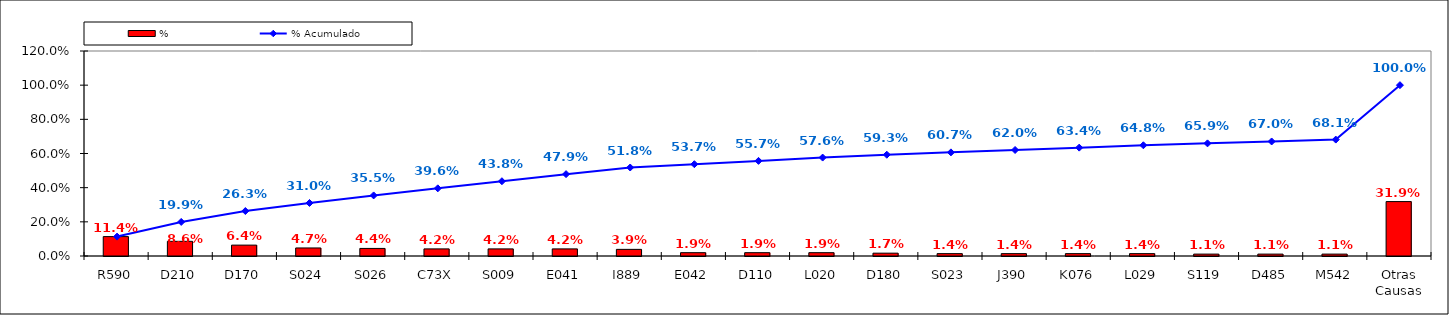
| Category | % |
|---|---|
| R590 | 0.114 |
| D210 | 0.086 |
| D170 | 0.064 |
| S024 | 0.047 |
| S026 | 0.044 |
| C73X | 0.042 |
| S009 | 0.042 |
| E041 | 0.042 |
| I889 | 0.039 |
| E042 | 0.019 |
| D110 | 0.019 |
| L020 | 0.019 |
| D180 | 0.017 |
| S023 | 0.014 |
| J390 | 0.014 |
| K076 | 0.014 |
| L029 | 0.014 |
| S119 | 0.011 |
| D485 | 0.011 |
| M542 | 0.011 |
| Otras Causas | 0.319 |